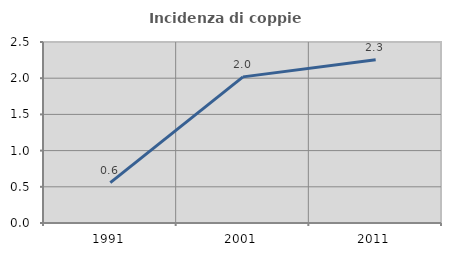
| Category | Incidenza di coppie miste |
|---|---|
| 1991.0 | 0.558 |
| 2001.0 | 2.018 |
| 2011.0 | 2.256 |